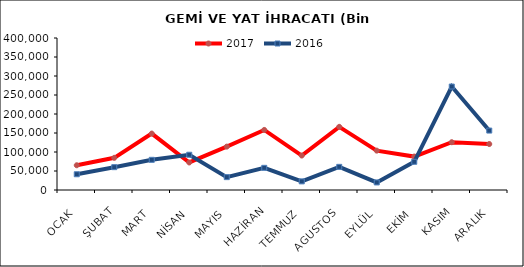
| Category | 2017 | 2016 |
|---|---|---|
| OCAK | 65125.64 | 41413.986 |
| ŞUBAT | 84700.491 | 60080.299 |
| MART | 148505.582 | 79413.773 |
| NİSAN | 72460.499 | 92766.23 |
| MAYIS | 114131.607 | 33853.179 |
| HAZİRAN | 158069.967 | 58315.611 |
| TEMMUZ | 90677.541 | 22686.377 |
| AGUSTOS | 166188.74 | 60904.216 |
| EYLÜL | 103600.683 | 19889.553 |
| EKİM | 87976.727 | 74240.672 |
| KASIM | 125763.031 | 272208.021 |
| ARALIK | 120957.904 | 156403.916 |